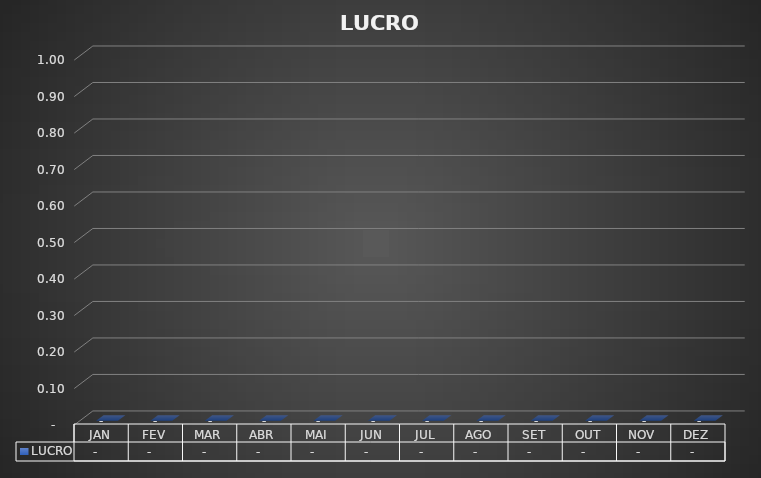
| Category | LUCRO |
|---|---|
| JAN | 0 |
| FEV | 0 |
| MAR | 0 |
| ABR | 0 |
| MAI | 0 |
| JUN | 0 |
| JUL | 0 |
| AGO | 0 |
| SET | 0 |
| OUT | 0 |
| NOV | 0 |
| DEZ | 0 |